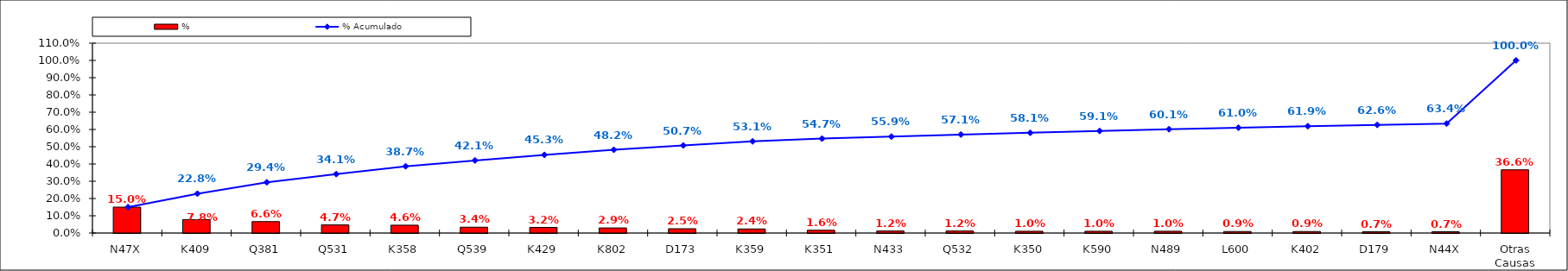
| Category | % |
|---|---|
| N47X | 0.15 |
| K409 | 0.078 |
| Q381 | 0.066 |
| Q531 | 0.047 |
| K358 | 0.046 |
| Q539 | 0.034 |
| K429 | 0.032 |
| K802 | 0.029 |
| D173 | 0.025 |
| K359 | 0.024 |
| K351 | 0.016 |
| N433 | 0.012 |
| Q532 | 0.012 |
| K350 | 0.01 |
| K590 | 0.01 |
| N489 | 0.01 |
| L600 | 0.009 |
| K402 | 0.009 |
| D179 | 0.007 |
| N44X | 0.007 |
| Otras Causas | 0.366 |